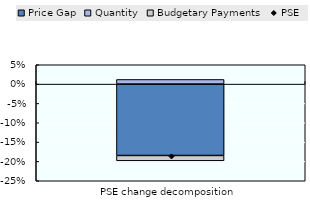
| Category | Price Gap | Quantity | Budgetary Payments |
|---|---|---|---|
| PSE change decomposition | -0.185 | 0.012 | -0.014 |